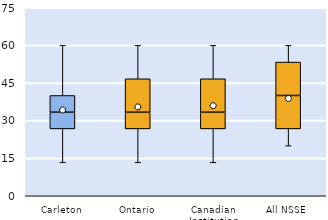
| Category | 25th | 50th | 75th |
|---|---|---|---|
| Carleton | 26.667 | 6.667 | 6.667 |
| Ontario | 26.667 | 6.667 | 13.333 |
| Canadian Institution | 26.667 | 6.667 | 13.333 |
| All NSSE | 26.667 | 13.333 | 13.333 |